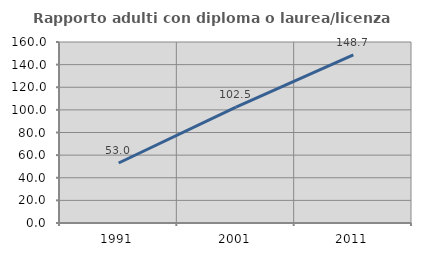
| Category | Rapporto adulti con diploma o laurea/licenza media  |
|---|---|
| 1991.0 | 53.03 |
| 2001.0 | 102.473 |
| 2011.0 | 148.71 |